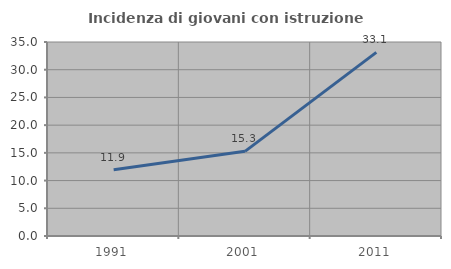
| Category | Incidenza di giovani con istruzione universitaria |
|---|---|
| 1991.0 | 11.942 |
| 2001.0 | 15.276 |
| 2011.0 | 33.126 |